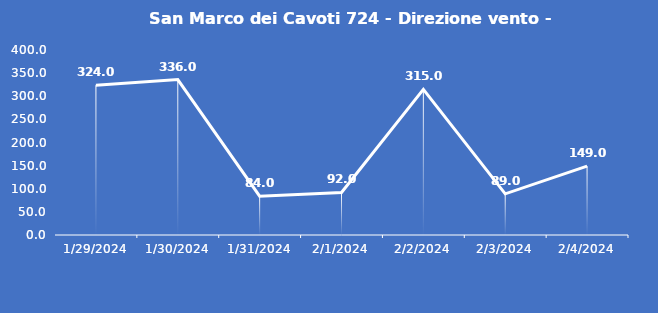
| Category | San Marco dei Cavoti 724 - Direzione vento - Grezzo (°N) |
|---|---|
| 1/29/24 | 324 |
| 1/30/24 | 336 |
| 1/31/24 | 84 |
| 2/1/24 | 92 |
| 2/2/24 | 315 |
| 2/3/24 | 89 |
| 2/4/24 | 149 |